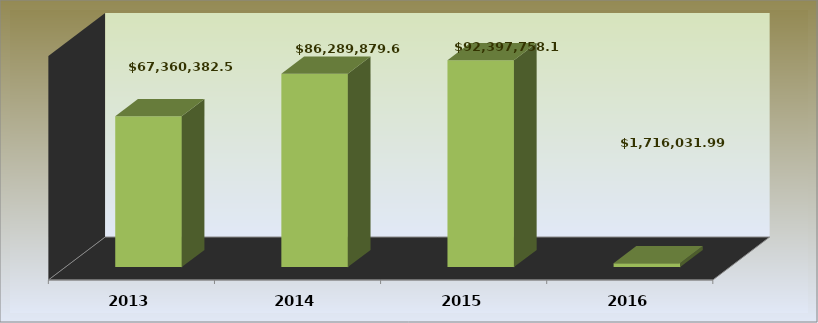
| Category | Series 0 |
|---|---|
| 2013.0 | 67360382.57 |
| 2014.0 | 86289879.62 |
| 2015.0 | 92397758.15 |
| 2016.0 | 1716031.99 |